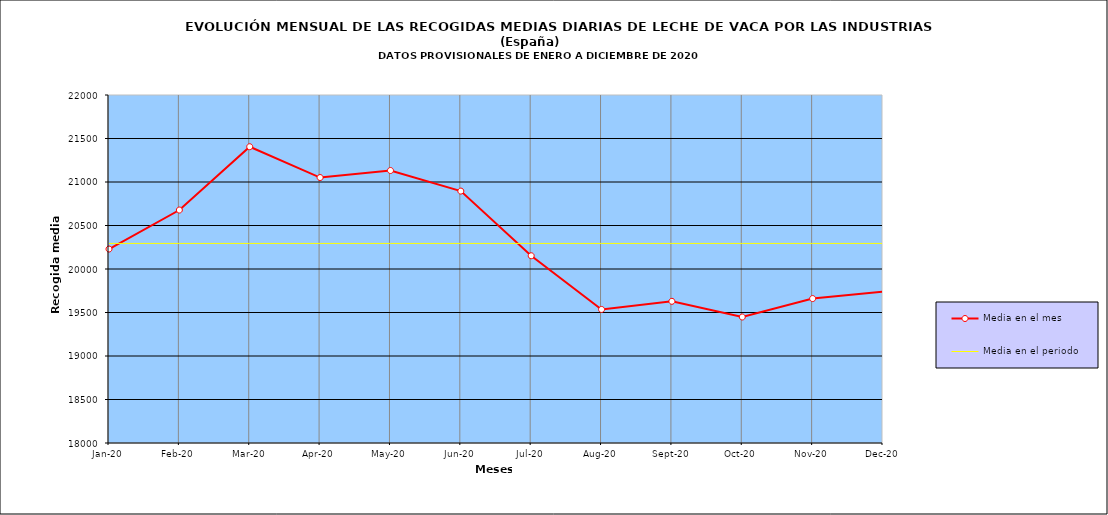
| Category | Media en el mes | Media en el periodo |
|---|---|---|
| 2020-01-01 | 20229.324 | 20294.022 |
| 2020-02-01 | 20677.799 | 20294.022 |
| 2020-03-01 | 21405.347 | 20294.022 |
| 2020-04-01 | 21051.231 | 20294.022 |
| 2020-05-01 | 21132.032 | 20294.022 |
| 2020-06-01 | 20895.5 | 20294.022 |
| 2020-07-01 | 20152 | 20294.022 |
| 2020-08-01 | 19535.129 | 20294.022 |
| 2020-09-01 | 19628.5 | 20294.022 |
| 2020-10-01 | 19448.328 | 20294.022 |
| 2020-11-01 | 19660.1 | 20294.022 |
| 2020-12-01 | 19739.645 | 20294.022 |